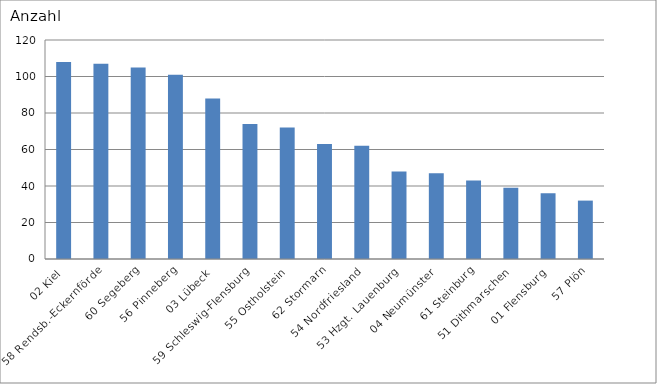
| Category | 02 Kiel 58 Rendsb.-Eckernförde 60 Segeberg 56 Pinneberg 03 Lübeck 59 Schleswig-Flensburg 55 Ostholstein 62 Stormarn 54 Nordfriesland 53 Hzgt. Lauenburg 04 Neumünster 61 Steinburg 51 Dithmarschen 01 Flensburg 57 Plön |
|---|---|
| 02 Kiel | 108 |
| 58 Rendsb.-Eckernförde | 107 |
| 60 Segeberg | 105 |
| 56 Pinneberg | 101 |
| 03 Lübeck | 88 |
| 59 Schleswig-Flensburg | 74 |
| 55 Ostholstein | 72 |
| 62 Stormarn | 63 |
| 54 Nordfriesland | 62 |
| 53 Hzgt. Lauenburg | 48 |
| 04 Neumünster | 47 |
| 61 Steinburg | 43 |
| 51 Dithmarschen | 39 |
| 01 Flensburg | 36 |
| 57 Plön | 32 |